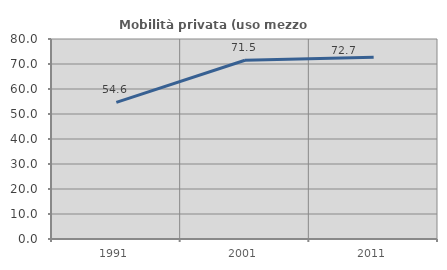
| Category | Mobilità privata (uso mezzo privato) |
|---|---|
| 1991.0 | 54.644 |
| 2001.0 | 71.492 |
| 2011.0 | 72.656 |